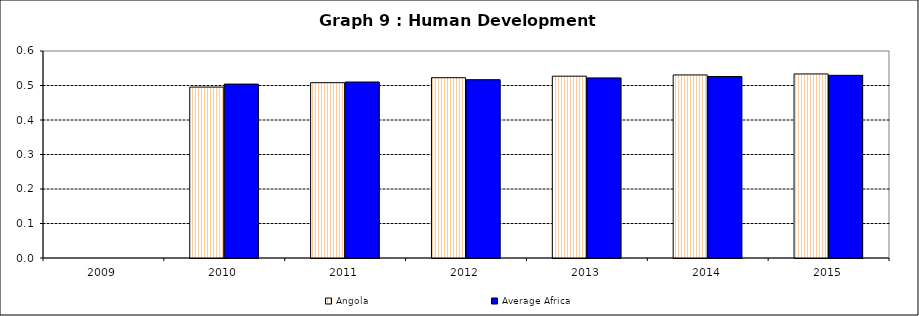
| Category | Angola | Average Africa |
|---|---|---|
| 2009.0 | 0 | 0 |
| 2010.0 | 0.495 | 0.504 |
| 2011.0 | 0.508 | 0.51 |
| 2012.0 | 0.523 | 0.517 |
| 2013.0 | 0.527 | 0.522 |
| 2014.0 | 0.531 | 0.526 |
| 2015.0 | 0.533 | 0.53 |